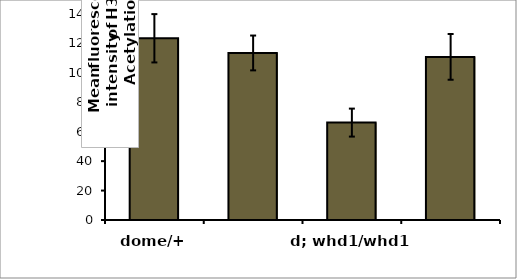
| Category | Series 0 |
|---|---|
| dome/+ | 123.505 |
| d/+  +Acetate | 113.527 |
| d; whd1/whd1 | 66.191 |
| d; whd1/whd1;  +Acetate | 110.853 |